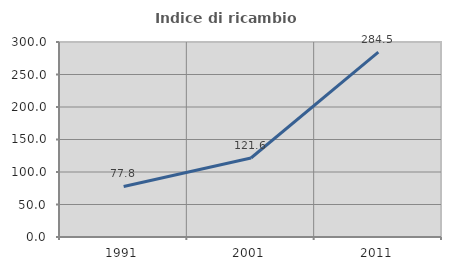
| Category | Indice di ricambio occupazionale  |
|---|---|
| 1991.0 | 77.756 |
| 2001.0 | 121.563 |
| 2011.0 | 284.462 |